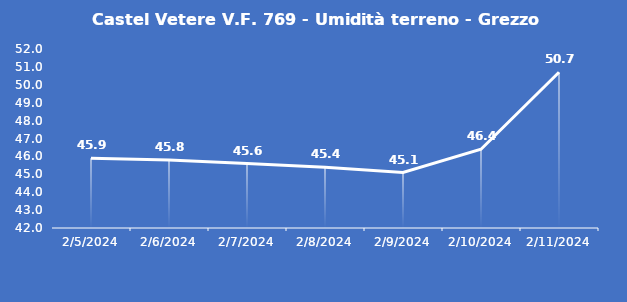
| Category | Castel Vetere V.F. 769 - Umidità terreno - Grezzo (%VWC) |
|---|---|
| 2/5/24 | 45.9 |
| 2/6/24 | 45.8 |
| 2/7/24 | 45.6 |
| 2/8/24 | 45.4 |
| 2/9/24 | 45.1 |
| 2/10/24 | 46.4 |
| 2/11/24 | 50.7 |